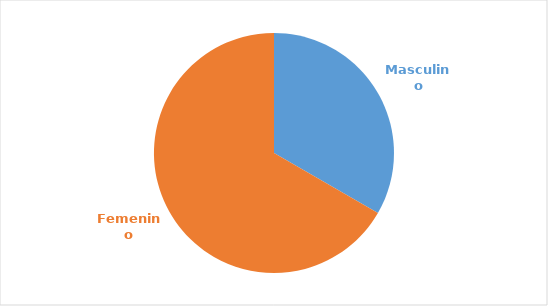
| Category | Series 0 |
|---|---|
| Masculino | 0.333 |
| Femenino | 0.667 |